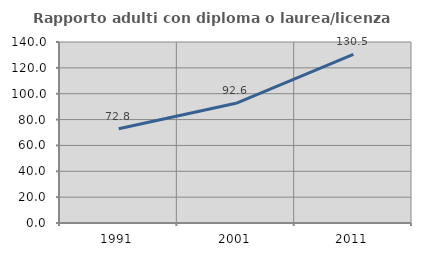
| Category | Rapporto adulti con diploma o laurea/licenza media  |
|---|---|
| 1991.0 | 72.835 |
| 2001.0 | 92.604 |
| 2011.0 | 130.488 |